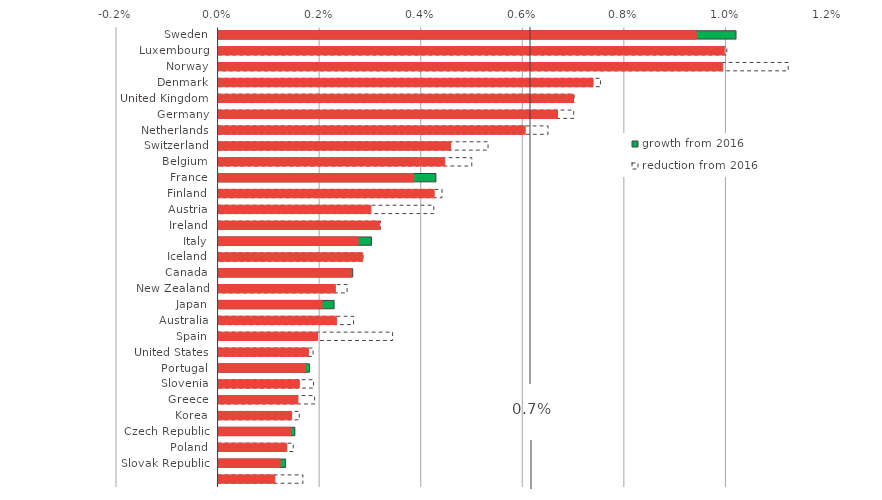
| Category | growth from 2016 | reduction from 2016 | Series 0 |
|---|---|---|---|
| Sweden | 0.01 | 0 | 0.009 |
| Luxembourg | 0 | 0.01 | 0.01 |
| Norway | 0 | 0.011 | 0.01 |
| Denmark | 0 | 0.008 | 0.007 |
| United Kingdom | 0 | 0.007 | 0.007 |
| Germany | 0 | 0.007 | 0.007 |
| Netherlands | 0 | 0.006 | 0.006 |
| Switzerland | 0 | 0.005 | 0.005 |
| Belgium | 0 | 0.005 | 0.004 |
| France | 0.004 | 0 | 0.004 |
| Finland | 0 | 0.004 | 0.004 |
| Austria | 0 | 0.004 | 0.003 |
| Ireland | 0 | 0.003 | 0.003 |
| Italy | 0.003 | 0 | 0.003 |
| Iceland | 0 | 0.003 | 0.003 |
| Canada | 0.003 | 0 | 0.003 |
| New Zealand | 0 | 0.003 | 0.002 |
| Japan | 0.002 | 0 | 0.002 |
| Australia | 0 | 0.003 | 0.002 |
| Spain | 0 | 0.003 | 0.002 |
| United States | 0 | 0.002 | 0.002 |
| Portugal | 0.002 | 0 | 0.002 |
| Slovenia | 0 | 0.002 | 0.002 |
| Greece | 0 | 0.002 | 0.002 |
| Korea | 0 | 0.002 | 0.001 |
| Czech Republic | 0.002 | 0 | 0.001 |
| Poland | 0 | 0.001 | 0.001 |
| Slovak Republic | 0.001 | 0 | 0.001 |